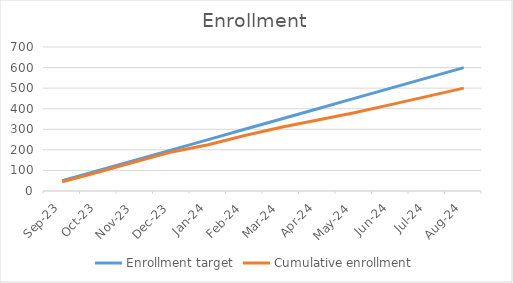
| Category | Enrollment target | Cumulative enrollment |
|---|---|---|
| Sep-23 | 50 | 45 |
| Oct-23 | 100 | 92 |
| Nov-23 | 150 | 142 |
| Dec-23 | 200 | 190 |
| Jan-24 | 250 | 225 |
| Feb-24 | 300 | 270 |
| Mar-24 | 350 | 310 |
| Apr-24 | 400 | 345 |
| May-24 | 450 | 380 |
| Jun-24 | 500 | 420 |
| Jul-24 | 550 | 460 |
| Aug-24 | 600 | 500 |